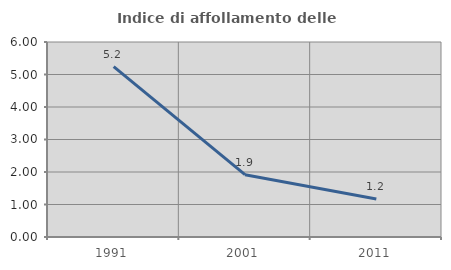
| Category | Indice di affollamento delle abitazioni  |
|---|---|
| 1991.0 | 5.241 |
| 2001.0 | 1.918 |
| 2011.0 | 1.17 |